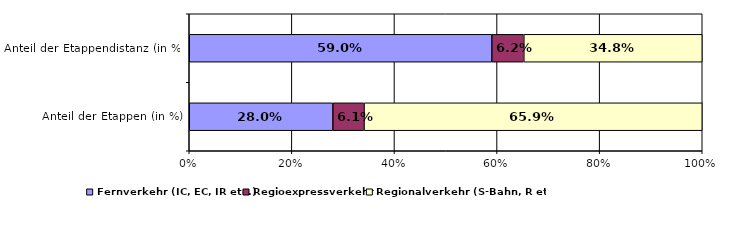
| Category | Fernverkehr (IC, EC, IR etc.) | Regioexpressverkehr | Regionalverkehr (S-Bahn, R etc.) |
|---|---|---|---|
| Anteil der Etappen (in %) | 0.28 | 0.061 | 0.659 |
| Anteil der Etappendistanz (in %) | 0.59 | 0.062 | 0.348 |